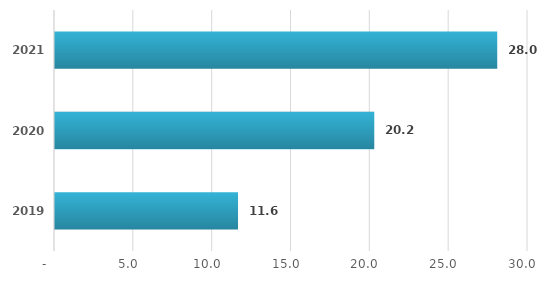
| Category | Series 0 |
|---|---|
| 2019.0 | 11.608 |
| 2020.0 | 20.25 |
| 2021.0 | 28.049 |